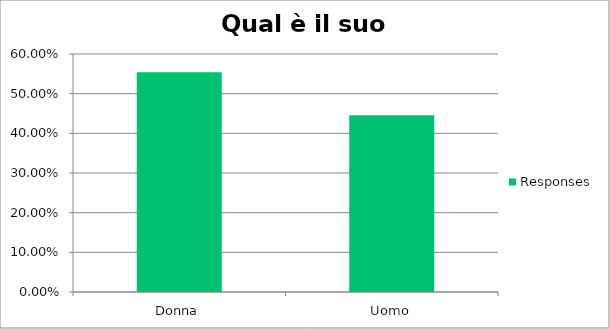
| Category | Responses |
|---|---|
| Donna | 0.554 |
| Uomo | 0.446 |